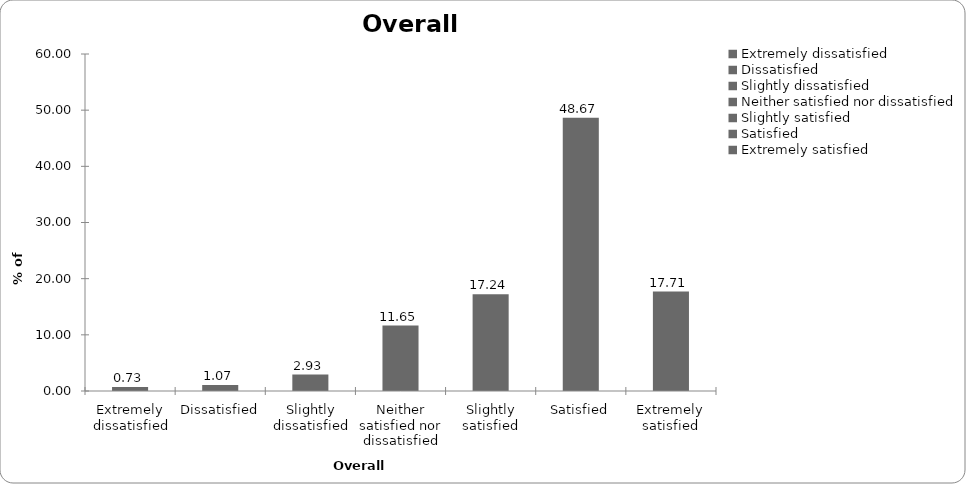
| Category | Overall satisfaction |
|---|---|
| Extremely dissatisfied | 0.732 |
| Dissatisfied | 1.065 |
| Slightly dissatisfied | 2.929 |
| Neither satisfied nor dissatisfied | 11.651 |
| Slightly satisfied | 17.244 |
| Satisfied | 48.668 |
| Extremely satisfied | 17.71 |